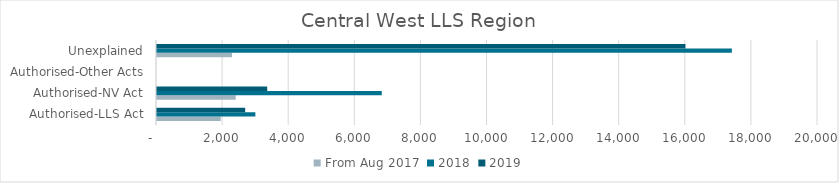
| Category | From Aug 2017 | 2018 | 2019 |
|---|---|---|---|
| Authorised-LLS Act | 1928 | 2976 | 2668 |
| Authorised-NV Act | 2381 | 6801 | 3334 |
| Authorised-Other Acts | 0 | 0 | 0 |
| Unexplained | 2270 | 17394 | 15989 |